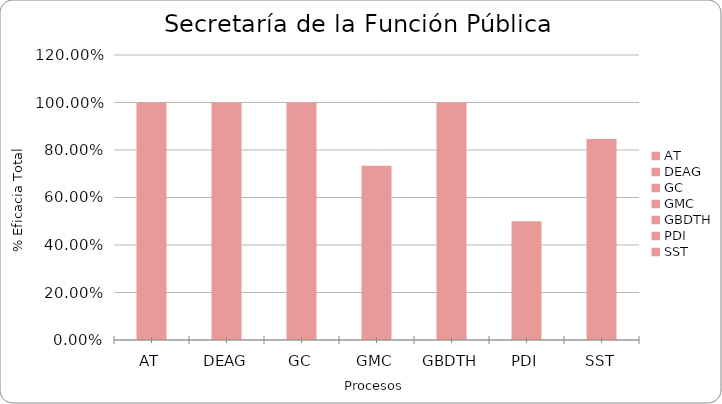
| Category | % Eficacia total |
|---|---|
| AT | 1 |
| DEAG | 1 |
| GC | 1 |
| GMC | 0.733 |
| GBDTH | 1 |
| PDI | 0.5 |
| SST | 0.846 |